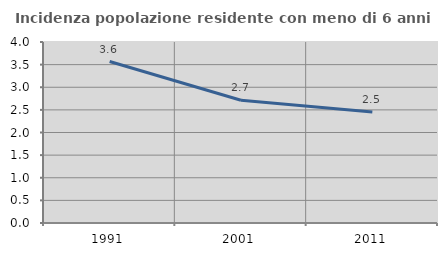
| Category | Incidenza popolazione residente con meno di 6 anni |
|---|---|
| 1991.0 | 3.568 |
| 2001.0 | 2.714 |
| 2011.0 | 2.454 |